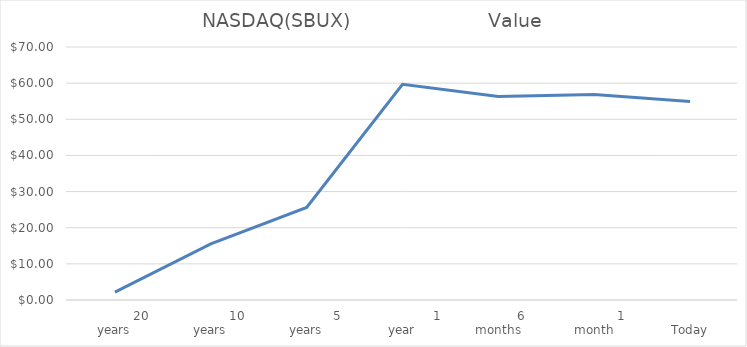
| Category | NASDAQ(SBUX) |
|---|---|
|              20 years | 2.18 |
|              10 years | 15.51 |
|                5 years | 25.59 |
|                  1 year | 59.7 |
|            6 months | 56.32 |
|              1 month | 56.86 |
|                  Today | 54.93 |